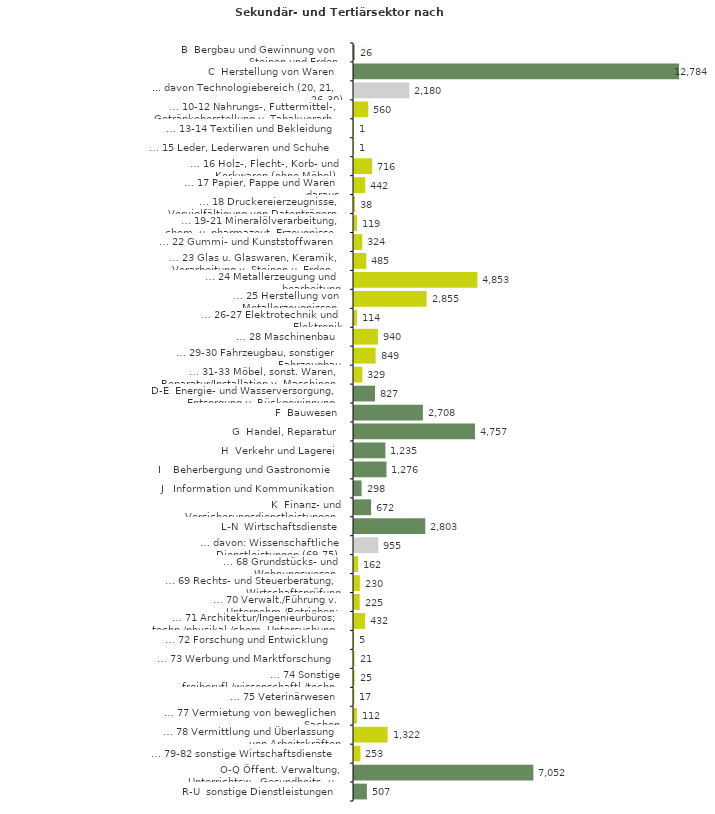
| Category | Series 0 |
|---|---|
| B  Bergbau und Gewinnung von Steinen und Erden | 26 |
| C  Herstellung von Waren | 12784 |
| ... davon Technologiebereich (20, 21, 26-30) | 2180 |
| … 10-12 Nahrungs-, Futtermittel-, Getränkeherstellung u. Tabakverarb. | 560 |
| … 13-14 Textilien und Bekleidung | 1 |
| … 15 Leder, Lederwaren und Schuhe | 1 |
| … 16 Holz-, Flecht-, Korb- und Korkwaren (ohne Möbel)  | 716 |
| … 17 Papier, Pappe und Waren daraus  | 442 |
| … 18 Druckereierzeugnisse, Vervielfältigung von Datenträgern | 38 |
| … 19-21 Mineralölverarbeitung, chem. u. pharmazeut. Erzeugnisse | 119 |
| … 22 Gummi- und Kunststoffwaren | 324 |
| … 23 Glas u. Glaswaren, Keramik, Verarbeitung v. Steinen u. Erden  | 485 |
| … 24 Metallerzeugung und -bearbeitung | 4853 |
| … 25 Herstellung von Metallerzeugnissen  | 2855 |
| … 26-27 Elektrotechnik und Elektronik | 114 |
| … 28 Maschinenbau | 940 |
| … 29-30 Fahrzeugbau, sonstiger Fahrzeugbau | 849 |
| … 31-33 Möbel, sonst. Waren, Reparatur/Installation v. Maschinen | 329 |
| D-E  Energie- und Wasserversorgung, Entsorgung u. Rückgewinnung | 827 |
| F  Bauwesen | 2708 |
| G  Handel, Reparatur | 4757 |
| H  Verkehr und Lagerei | 1235 |
| I    Beherbergung und Gastronomie | 1276 |
| J   Information und Kommunikation | 298 |
| K  Finanz- und Versicherungsdienstleistungen | 672 |
| L-N  Wirtschaftsdienste | 2803 |
| … davon: Wissenschaftliche Dienstleistungen (69-75) | 955 |
| … 68 Grundstücks- und Wohnungswesen  | 162 |
| … 69 Rechts- und Steuerberatung, Wirtschaftsprüfung | 230 |
| … 70 Verwalt./Führung v. Unternehm./Betrieben; Unternehmensberat. | 225 |
| … 71 Architektur/Ingenieurbüros; techn./physikal./chem. Untersuchung | 432 |
| … 72 Forschung und Entwicklung  | 5 |
| … 73 Werbung und Marktforschung | 21 |
| … 74 Sonstige freiberufl./wissenschaftl./techn. Tätigkeiten | 25 |
| … 75 Veterinärwesen | 17 |
| … 77 Vermietung von beweglichen Sachen  | 112 |
| … 78 Vermittlung und Überlassung von Arbeitskräften | 1322 |
| … 79-82 sonstige Wirtschaftsdienste | 253 |
| O-Q Öffent. Verwaltung, Unterrichtsw., Gesundheits- u. Sozialwesen | 7052 |
| R-U  sonstige Dienstleistungen | 507 |